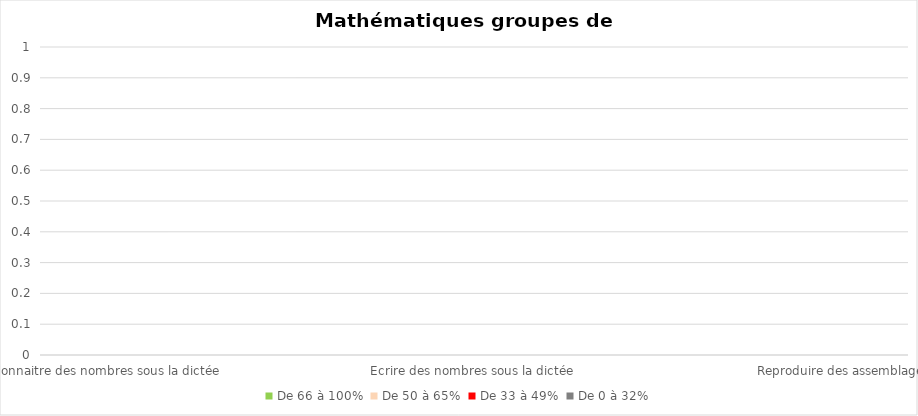
| Category | De 66 à 100% | De 50 à 65% | De 33 à 49% | De 0 à 32% |
|---|---|---|---|---|
| Reconnaitre des nombres sous la dictée | 0 | 0 | 0 | 0 |
| Résoudre des problèmes | 0 | 0 | 0 | 0 |
| Dénombrer une collection jusqu'à10 et l'associer à un chiffre | 0 | 0 | 0 | 0 |
| Ecrire des nombres sous la dictée | 0 | 0 | 0 | 0 |
| Comparer des nombres | 0 | 0 | 0 | 0 |
| Placer un nombre sur une ligne numérique | 0 | 0 | 0 | 0 |
| Reproduire des assemblages | 0 | 0 | 0 | 0 |